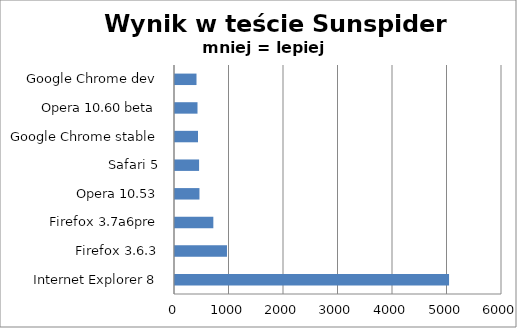
| Category | Series 0 |
|---|---|
| Internet Explorer 8 | 5028.733 |
| Firefox 3.6.3 | 953.8 |
| Firefox 3.7a6pre | 703.4 |
| Opera 10.53 | 448.733 |
| Safari 5 | 441.933 |
| Google Chrome stable | 422.267 |
| Opera 10.60 beta | 412.933 |
| Google Chrome dev | 394.467 |